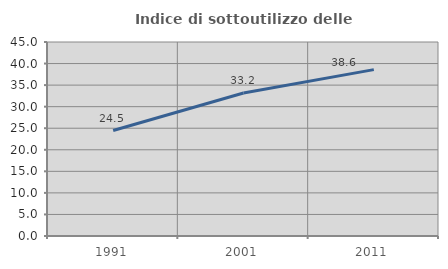
| Category | Indice di sottoutilizzo delle abitazioni  |
|---|---|
| 1991.0 | 24.464 |
| 2001.0 | 33.185 |
| 2011.0 | 38.596 |